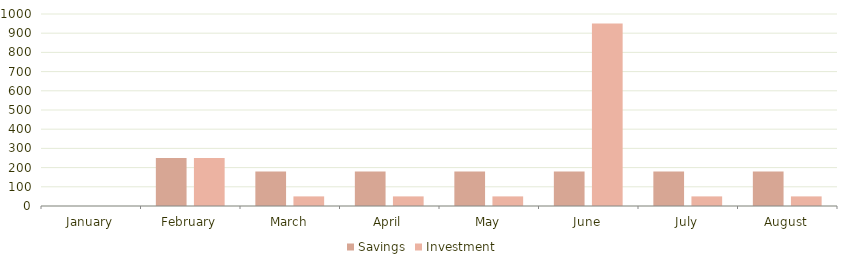
| Category | Savings | Investment |
|---|---|---|
| January | 0 | 0 |
| February | 250 | 250 |
| March | 180 | 50 |
| April | 180 | 50 |
| May | 180 | 50 |
| June | 180 | 950 |
| July | 180 | 50 |
| August | 180 | 50 |